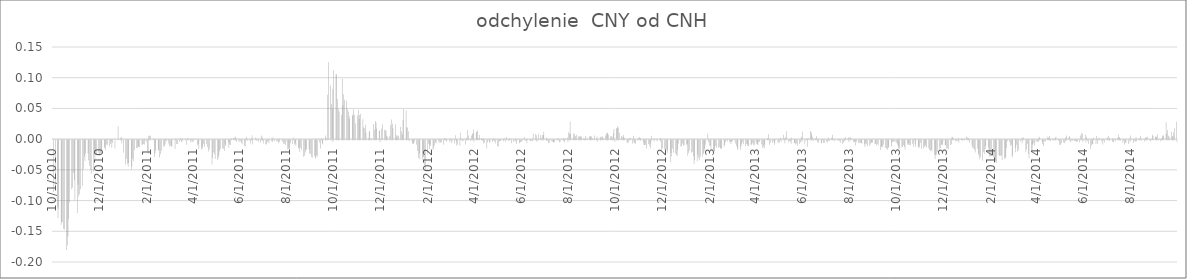
| Category | odchylenie  CNY od CNH |
|---|---|
| 10/1/10 | -0.084 |
| 10/4/10 | -0.08 |
| 10/5/10 | 0 |
| 10/6/10 | -0.109 |
| 10/7/10 | -0.127 |
| 10/8/10 | -0.112 |
| 10/11/10 | -0.138 |
| 10/12/10 | -0.133 |
| 10/13/10 | -0.133 |
| 10/14/10 | -0.144 |
| 10/15/10 | -0.146 |
| 10/18/10 | -0.179 |
| 10/19/10 | -0.171 |
| 10/20/10 | -0.157 |
| 10/21/10 | -0.128 |
| 10/22/10 | -0.101 |
| 10/25/10 | -0.08 |
| 10/26/10 | -0.077 |
| 10/27/10 | -0.054 |
| 10/28/10 | -0.065 |
| 10/29/10 | -0.098 |
| 11/1/10 | -0.119 |
| 11/2/10 | -0.072 |
| 11/3/10 | -0.092 |
| 11/4/10 | -0.088 |
| 11/5/10 | -0.08 |
| 11/8/10 | -0.074 |
| 11/9/10 | -0.047 |
| 11/10/10 | -0.026 |
| 11/11/10 | -0.034 |
| 11/12/10 | -0.022 |
| 11/15/10 | -0.022 |
| 11/16/10 | -0.033 |
| 11/17/10 | -0.042 |
| 11/18/10 | -0.048 |
| 11/19/10 | -0.055 |
| 11/22/10 | -0.051 |
| 11/23/10 | -0.023 |
| 11/24/10 | -0.033 |
| 11/25/10 | -0.021 |
| 11/26/10 | -0.024 |
| 11/29/10 | -0.02 |
| 11/30/10 | -0.025 |
| 12/1/10 | -0.021 |
| 12/2/10 | -0.016 |
| 12/3/10 | -0.021 |
| 12/6/10 | -0.013 |
| 12/7/10 | -0.011 |
| 12/8/10 | -0.017 |
| 12/9/10 | -0.007 |
| 12/10/10 | -0.008 |
| 12/13/10 | -0.01 |
| 12/14/10 | -0.006 |
| 12/15/10 | -0.002 |
| 12/16/10 | -0.013 |
| 12/17/10 | -0.004 |
| 12/20/10 | -0.014 |
| 12/21/10 | 0 |
| 12/22/10 | 0 |
| 12/23/10 | 0 |
| 12/24/10 | 0.021 |
| 12/27/10 | 0.002 |
| 12/28/10 | 0.003 |
| 12/29/10 | -0.005 |
| 12/30/10 | 0 |
| 12/31/10 | -0.02 |
| 1/3/11 | -0.04 |
| 1/4/11 | -0.03 |
| 1/5/11 | -0.039 |
| 1/6/11 | -0.044 |
| 1/7/11 | -0.037 |
| 1/10/11 | -0.048 |
| 1/11/11 | -0.043 |
| 1/12/11 | -0.031 |
| 1/13/11 | -0.034 |
| 1/14/11 | -0.017 |
| 1/17/11 | -0.013 |
| 1/18/11 | -0.013 |
| 1/19/11 | -0.01 |
| 1/20/11 | -0.011 |
| 1/21/11 | -0.011 |
| 1/24/11 | -0.007 |
| 1/25/11 | -0.007 |
| 1/26/11 | -0.006 |
| 1/27/11 | -0.007 |
| 1/28/11 | 0 |
| 1/31/11 | -0.018 |
| 2/1/11 | -0.023 |
| 2/2/11 | 0.005 |
| 2/3/11 | 0.005 |
| 2/4/11 | 0.005 |
| 2/7/11 | 0 |
| 2/8/11 | 0.001 |
| 2/9/11 | -0.027 |
| 2/10/11 | -0.022 |
| 2/11/11 | -0.017 |
| 2/14/11 | -0.016 |
| 2/15/11 | -0.016 |
| 2/16/11 | -0.028 |
| 2/17/11 | -0.023 |
| 2/18/11 | -0.017 |
| 2/21/11 | -0.011 |
| 2/22/11 | -0.011 |
| 2/23/11 | -0.007 |
| 2/24/11 | 0.001 |
| 2/25/11 | -0.002 |
| 2/28/11 | -0.005 |
| 3/1/11 | -0.011 |
| 3/2/11 | -0.009 |
| 3/3/11 | -0.01 |
| 3/4/11 | -0.011 |
| 3/7/11 | 0 |
| 3/8/11 | -0.014 |
| 3/9/11 | 0.001 |
| 3/10/11 | -0.006 |
| 3/11/11 | -0.006 |
| 3/14/11 | -0.003 |
| 3/15/11 | 0.002 |
| 3/16/11 | -0.002 |
| 3/17/11 | -0.003 |
| 3/18/11 | 0.001 |
| 3/21/11 | 0 |
| 3/22/11 | 0 |
| 3/23/11 | -0.008 |
| 3/24/11 | 0.002 |
| 3/25/11 | 0.001 |
| 3/28/11 | -0.003 |
| 3/29/11 | 0.001 |
| 3/30/11 | 0.001 |
| 3/31/11 | -0.003 |
| 4/1/11 | -0.002 |
| 4/4/11 | 0 |
| 4/5/11 | 0 |
| 4/6/11 | -0.008 |
| 4/7/11 | -0.006 |
| 4/8/11 | -0.014 |
| 4/11/11 | -0.015 |
| 4/12/11 | -0.011 |
| 4/13/11 | -0.014 |
| 4/14/11 | -0.006 |
| 4/15/11 | -0.011 |
| 4/18/11 | -0.007 |
| 4/19/11 | -0.011 |
| 4/20/11 | -0.018 |
| 4/21/11 | 0 |
| 4/22/11 | -0.015 |
| 4/25/11 | -0.04 |
| 4/26/11 | -0.029 |
| 4/27/11 | -0.02 |
| 4/28/11 | -0.023 |
| 4/29/11 | -0.03 |
| 5/2/11 | -0.032 |
| 5/3/11 | -0.03 |
| 5/4/11 | -0.024 |
| 5/5/11 | -0.018 |
| 5/6/11 | -0.014 |
| 5/9/11 | -0.013 |
| 5/10/11 | -0.014 |
| 5/11/11 | -0.018 |
| 5/12/11 | -0.007 |
| 5/13/11 | -0.01 |
| 5/16/11 | -0.004 |
| 5/17/11 | -0.013 |
| 5/18/11 | -0.007 |
| 5/19/11 | -0.008 |
| 5/20/11 | 0.001 |
| 5/23/11 | 0.002 |
| 5/24/11 | 0.002 |
| 5/25/11 | 0.004 |
| 5/26/11 | 0.002 |
| 5/27/11 | -0.003 |
| 5/30/11 | -0.001 |
| 5/31/11 | 0.001 |
| 6/1/11 | -0.002 |
| 6/2/11 | -0.004 |
| 6/3/11 | -0.006 |
| 6/6/11 | -0.009 |
| 6/7/11 | -0.01 |
| 6/8/11 | 0 |
| 6/9/11 | 0.004 |
| 6/10/11 | -0.001 |
| 6/13/11 | -0.001 |
| 6/14/11 | -0.005 |
| 6/15/11 | 0.001 |
| 6/16/11 | 0.006 |
| 6/17/11 | -0.007 |
| 6/20/11 | 0 |
| 6/21/11 | 0.003 |
| 6/22/11 | -0.001 |
| 6/23/11 | 0 |
| 6/24/11 | -0.003 |
| 6/27/11 | -0.004 |
| 6/28/11 | 0.006 |
| 6/29/11 | 0.004 |
| 6/30/11 | -0.001 |
| 7/1/11 | -0.006 |
| 7/4/11 | -0.007 |
| 7/5/11 | -0.007 |
| 7/6/11 | -0.003 |
| 7/7/11 | -0.002 |
| 7/8/11 | -0.005 |
| 7/11/11 | -0.002 |
| 7/12/11 | 0.003 |
| 7/13/11 | -0.003 |
| 7/14/11 | 0.001 |
| 7/15/11 | -0.001 |
| 7/18/11 | -0.002 |
| 7/19/11 | -0.002 |
| 7/20/11 | -0.005 |
| 7/21/11 | 0.001 |
| 7/22/11 | -0.003 |
| 7/25/11 | 0 |
| 7/26/11 | -0.003 |
| 7/27/11 | -0.006 |
| 7/28/11 | -0.006 |
| 7/29/11 | -0.008 |
| 8/1/11 | -0.015 |
| 8/2/11 | -0.015 |
| 8/3/11 | -0.012 |
| 8/4/11 | -0.015 |
| 8/5/11 | -0.005 |
| 8/8/11 | -0.006 |
| 8/9/11 | 0.003 |
| 8/10/11 | -0.007 |
| 8/11/11 | -0.006 |
| 8/12/11 | -0.009 |
| 8/15/11 | -0.013 |
| 8/16/11 | -0.012 |
| 8/17/11 | -0.019 |
| 8/18/11 | -0.013 |
| 8/19/11 | -0.016 |
| 8/22/11 | -0.027 |
| 8/23/11 | -0.026 |
| 8/24/11 | -0.02 |
| 8/25/11 | -0.016 |
| 8/26/11 | -0.015 |
| 8/29/11 | -0.015 |
| 8/30/11 | -0.022 |
| 8/31/11 | -0.022 |
| 9/1/11 | -0.027 |
| 9/2/11 | -0.028 |
| 9/5/11 | -0.026 |
| 9/6/11 | -0.03 |
| 9/7/11 | -0.028 |
| 9/8/11 | -0.024 |
| 9/9/11 | -0.027 |
| 9/12/11 | -0.004 |
| 9/13/11 | -0.014 |
| 9/14/11 | 0.002 |
| 9/15/11 | -0.005 |
| 9/16/11 | -0.006 |
| 9/19/11 | 0.006 |
| 9/20/11 | 0.002 |
| 9/21/11 | 0 |
| 9/22/11 | 0.072 |
| 9/23/11 | 0.126 |
| 9/26/11 | 0.088 |
| 9/27/11 | 0.058 |
| 9/28/11 | 0.049 |
| 9/29/11 | 0.082 |
| 9/30/11 | 0.112 |
| 10/3/11 | 0.106 |
| 10/4/11 | 0.106 |
| 10/5/11 | 0.066 |
| 10/6/11 | 0.049 |
| 10/7/11 | 0.045 |
| 10/10/11 | 0.04 |
| 10/11/11 | 0.098 |
| 10/12/11 | 0.055 |
| 10/13/11 | 0.073 |
| 10/14/11 | 0.064 |
| 10/17/11 | 0.063 |
| 10/18/11 | 0.05 |
| 10/19/11 | 0.045 |
| 10/20/11 | 0.037 |
| 10/21/11 | 0.033 |
| 10/24/11 | 0.038 |
| 10/25/11 | 0.04 |
| 10/26/11 | 0.049 |
| 10/27/11 | 0.04 |
| 10/28/11 | 0.026 |
| 10/31/11 | 0.038 |
| 11/1/11 | 0.047 |
| 11/2/11 | 0.033 |
| 11/3/11 | 0.039 |
| 11/4/11 | 0.042 |
| 11/7/11 | 0.032 |
| 11/8/11 | 0.019 |
| 11/9/11 | 0.018 |
| 11/10/11 | 0.024 |
| 11/11/11 | 0.011 |
| 11/14/11 | 0.002 |
| 11/15/11 | 0.013 |
| 11/16/11 | 0.013 |
| 11/17/11 | 0 |
| 11/18/11 | 0.001 |
| 11/21/11 | 0.025 |
| 11/22/11 | 0.016 |
| 11/23/11 | 0.029 |
| 11/24/11 | 0.026 |
| 11/25/11 | 0.017 |
| 11/28/11 | 0.014 |
| 11/29/11 | 0.014 |
| 11/30/11 | 0.001 |
| 12/1/11 | 0.018 |
| 12/2/11 | 0.024 |
| 12/5/11 | 0.015 |
| 12/6/11 | 0.015 |
| 12/7/11 | 0.013 |
| 12/8/11 | 0.006 |
| 12/9/11 | 0.004 |
| 12/12/11 | 0.005 |
| 12/13/11 | 0.023 |
| 12/14/11 | 0.032 |
| 12/15/11 | 0.026 |
| 12/16/11 | 0.018 |
| 12/19/11 | 0.024 |
| 12/20/11 | 0.007 |
| 12/21/11 | 0.004 |
| 12/22/11 | 0.006 |
| 12/23/11 | 0.006 |
| 12/26/11 | 0.02 |
| 12/27/11 | 0.013 |
| 12/28/11 | 0.008 |
| 12/29/11 | 0.031 |
| 12/30/11 | 0.049 |
| 1/2/12 | 0.047 |
| 1/3/12 | 0.02 |
| 1/4/12 | 0.019 |
| 1/5/12 | 0.013 |
| 1/6/12 | -0.002 |
| 1/9/12 | 0 |
| 1/10/12 | -0.006 |
| 1/11/12 | -0.005 |
| 1/12/12 | -0.006 |
| 1/13/12 | -0.002 |
| 1/16/12 | -0.008 |
| 1/17/12 | -0.018 |
| 1/18/12 | -0.029 |
| 1/19/12 | -0.021 |
| 1/20/12 | -0.031 |
| 1/23/12 | -0.032 |
| 1/24/12 | -0.027 |
| 1/25/12 | -0.028 |
| 1/26/12 | -0.041 |
| 1/27/12 | -0.047 |
| 1/30/12 | -0.023 |
| 1/31/12 | -0.006 |
| 2/1/12 | -0.014 |
| 2/2/12 | -0.008 |
| 2/3/12 | -0.01 |
| 2/6/12 | -0.016 |
| 2/7/12 | -0.013 |
| 2/8/12 | -0.008 |
| 2/9/12 | -0.004 |
| 2/10/12 | -0.005 |
| 2/13/12 | -0.002 |
| 2/14/12 | 0 |
| 2/15/12 | -0.005 |
| 2/16/12 | -0.003 |
| 2/17/12 | -0.003 |
| 2/20/12 | -0.007 |
| 2/21/12 | 0.002 |
| 2/22/12 | 0.001 |
| 2/23/12 | -0.002 |
| 2/24/12 | -0.002 |
| 2/27/12 | 0.001 |
| 2/28/12 | -0.003 |
| 2/29/12 | 0.002 |
| 3/1/12 | -0.005 |
| 3/2/12 | -0.002 |
| 3/5/12 | -0.006 |
| 3/6/12 | 0.006 |
| 3/7/12 | -0.002 |
| 3/8/12 | -0.009 |
| 3/9/12 | -0.007 |
| 3/12/12 | -0.009 |
| 3/13/12 | 0.01 |
| 3/14/12 | 0.001 |
| 3/15/12 | -0.001 |
| 3/16/12 | -0.002 |
| 3/19/12 | -0.007 |
| 3/20/12 | 0.001 |
| 3/21/12 | 0.001 |
| 3/22/12 | 0.015 |
| 3/23/12 | 0.006 |
| 3/26/12 | -0.002 |
| 3/27/12 | 0.006 |
| 3/28/12 | 0.009 |
| 3/29/12 | 0.009 |
| 3/30/12 | 0.016 |
| 4/2/12 | 0.011 |
| 4/3/12 | 0.012 |
| 4/4/12 | 0.014 |
| 4/5/12 | 0.002 |
| 4/6/12 | 0.007 |
| 4/9/12 | 0.002 |
| 4/10/12 | -0.001 |
| 4/11/12 | 0.002 |
| 4/12/12 | -0.005 |
| 4/13/12 | -0.005 |
| 4/16/12 | -0.014 |
| 4/17/12 | -0.003 |
| 4/18/12 | 0 |
| 4/19/12 | -0.004 |
| 4/20/12 | -0.003 |
| 4/23/12 | -0.003 |
| 4/24/12 | -0.001 |
| 4/25/12 | 0.002 |
| 4/26/12 | -0.002 |
| 4/27/12 | -0.005 |
| 4/30/12 | -0.009 |
| 5/1/12 | -0.011 |
| 5/2/12 | -0.002 |
| 5/3/12 | -0.001 |
| 5/4/12 | -0.002 |
| 5/7/12 | 0 |
| 5/8/12 | -0.002 |
| 5/9/12 | 0.001 |
| 5/10/12 | -0.002 |
| 5/11/12 | 0.003 |
| 5/14/12 | -0.001 |
| 5/15/12 | 0.001 |
| 5/16/12 | 0.002 |
| 5/17/12 | 0 |
| 5/18/12 | -0.005 |
| 5/21/12 | -0.003 |
| 5/22/12 | -0.001 |
| 5/23/12 | -0.002 |
| 5/24/12 | -0.006 |
| 5/25/12 | 0.001 |
| 5/28/12 | -0.005 |
| 5/29/12 | -0.003 |
| 5/30/12 | -0.003 |
| 5/31/12 | -0.003 |
| 6/1/12 | 0 |
| 6/4/12 | 0.003 |
| 6/5/12 | -0.001 |
| 6/6/12 | 0 |
| 6/7/12 | -0.005 |
| 6/8/12 | 0 |
| 6/11/12 | -0.002 |
| 6/12/12 | -0.001 |
| 6/13/12 | -0.001 |
| 6/14/12 | -0.002 |
| 6/15/12 | 0.009 |
| 6/18/12 | 0.008 |
| 6/19/12 | 0.006 |
| 6/20/12 | -0.002 |
| 6/21/12 | 0 |
| 6/22/12 | 0.009 |
| 6/25/12 | 0.007 |
| 6/26/12 | 0.002 |
| 6/27/12 | 0.007 |
| 6/28/12 | 0.006 |
| 6/29/12 | 0.012 |
| 7/2/12 | 0.003 |
| 7/3/12 | -0.001 |
| 7/4/12 | -0.001 |
| 7/5/12 | -0.005 |
| 7/6/12 | -0.004 |
| 7/9/12 | -0.002 |
| 7/10/12 | -0.002 |
| 7/11/12 | -0.004 |
| 7/12/12 | -0.003 |
| 7/13/12 | -0.003 |
| 7/16/12 | 0 |
| 7/17/12 | 0.002 |
| 7/18/12 | 0.001 |
| 7/19/12 | -0.003 |
| 7/20/12 | -0.003 |
| 7/23/12 | 0 |
| 7/24/12 | 0.002 |
| 7/25/12 | -0.001 |
| 7/26/12 | -0.004 |
| 7/27/12 | 0.001 |
| 7/30/12 | 0.003 |
| 7/31/12 | 0.011 |
| 8/1/12 | 0.009 |
| 8/2/12 | 0.029 |
| 8/3/12 | 0.009 |
| 8/6/12 | 0.003 |
| 8/7/12 | 0.01 |
| 8/8/12 | 0.008 |
| 8/9/12 | 0.005 |
| 8/10/12 | 0.007 |
| 8/13/12 | 0.005 |
| 8/14/12 | 0.004 |
| 8/15/12 | 0.005 |
| 8/16/12 | 0.003 |
| 8/17/12 | 0.005 |
| 8/20/12 | 0.002 |
| 8/21/12 | 0 |
| 8/22/12 | 0.005 |
| 8/23/12 | 0 |
| 8/24/12 | 0.002 |
| 8/27/12 | 0.004 |
| 8/28/12 | 0.005 |
| 8/29/12 | 0.004 |
| 8/30/12 | 0.004 |
| 8/31/12 | 0.002 |
| 9/3/12 | 0.006 |
| 9/4/12 | 0 |
| 9/5/12 | 0.001 |
| 9/6/12 | 0.004 |
| 9/7/12 | -0.003 |
| 9/10/12 | 0.004 |
| 9/11/12 | 0.002 |
| 9/12/12 | 0.004 |
| 9/13/12 | 0.005 |
| 9/14/12 | 0.002 |
| 9/17/12 | 0.006 |
| 9/18/12 | 0.009 |
| 9/19/12 | 0.009 |
| 9/20/12 | 0.01 |
| 9/21/12 | 0.007 |
| 9/24/12 | 0.005 |
| 9/25/12 | 0.005 |
| 9/26/12 | 0.003 |
| 9/27/12 | 0.009 |
| 9/28/12 | 0.016 |
| 10/1/12 | 0.018 |
| 10/2/12 | 0.017 |
| 10/3/12 | 0.021 |
| 10/4/12 | 0.019 |
| 10/5/12 | 0.011 |
| 10/8/12 | 0.005 |
| 10/9/12 | 0.004 |
| 10/10/12 | 0.007 |
| 10/11/12 | 0.003 |
| 10/12/12 | 0.001 |
| 10/15/12 | -0.005 |
| 10/16/12 | -0.003 |
| 10/17/12 | -0.004 |
| 10/18/12 | 0.001 |
| 10/19/12 | 0.002 |
| 10/22/12 | -0.005 |
| 10/23/12 | 0.006 |
| 10/24/12 | -0.003 |
| 10/25/12 | -0.005 |
| 10/26/12 | -0.006 |
| 10/29/12 | 0 |
| 10/30/12 | 0.002 |
| 10/31/12 | 0.003 |
| 11/1/12 | 0.002 |
| 11/2/12 | -0.001 |
| 11/5/12 | -0.004 |
| 11/6/12 | -0.008 |
| 11/7/12 | -0.008 |
| 11/8/12 | -0.008 |
| 11/9/12 | -0.014 |
| 11/12/12 | -0.006 |
| 11/13/12 | -0.009 |
| 11/14/12 | -0.013 |
| 11/15/12 | -0.005 |
| 11/16/12 | 0.006 |
| 11/19/12 | -0.002 |
| 11/20/12 | 0.001 |
| 11/21/12 | 0 |
| 11/22/12 | 0 |
| 11/23/12 | -0.002 |
| 11/26/12 | 0 |
| 11/27/12 | 0.002 |
| 11/28/12 | -0.003 |
| 11/29/12 | -0.017 |
| 11/30/12 | -0.013 |
| 12/3/12 | -0.015 |
| 12/4/12 | -0.019 |
| 12/5/12 | -0.016 |
| 12/6/12 | -0.016 |
| 12/7/12 | -0.02 |
| 12/10/12 | -0.036 |
| 12/11/12 | -0.021 |
| 12/12/12 | -0.027 |
| 12/13/12 | -0.014 |
| 12/14/12 | -0.02 |
| 12/17/12 | -0.022 |
| 12/18/12 | -0.024 |
| 12/19/12 | -0.025 |
| 12/20/12 | -0.016 |
| 12/21/12 | -0.005 |
| 12/24/12 | -0.011 |
| 12/25/12 | -0.01 |
| 12/26/12 | -0.006 |
| 12/27/12 | -0.009 |
| 12/28/12 | -0.008 |
| 12/31/12 | -0.007 |
| 1/1/13 | -0.007 |
| 1/2/13 | -0.026 |
| 1/3/13 | -0.021 |
| 1/4/13 | -0.017 |
| 1/7/13 | -0.02 |
| 1/8/13 | -0.019 |
| 1/9/13 | -0.026 |
| 1/10/13 | -0.039 |
| 1/11/13 | -0.032 |
| 1/14/13 | -0.035 |
| 1/15/13 | -0.023 |
| 1/16/13 | -0.029 |
| 1/17/13 | -0.033 |
| 1/18/13 | -0.026 |
| 1/21/13 | -0.027 |
| 1/22/13 | -0.023 |
| 1/23/13 | -0.018 |
| 1/24/13 | -0.014 |
| 1/25/13 | -0.007 |
| 1/28/13 | 0.009 |
| 1/29/13 | -0.004 |
| 1/30/13 | -0.009 |
| 1/31/13 | -0.009 |
| 2/1/13 | -0.015 |
| 2/4/13 | -0.016 |
| 2/5/13 | -0.018 |
| 2/6/13 | -0.018 |
| 2/7/13 | -0.01 |
| 2/8/13 | -0.012 |
| 2/11/13 | -0.013 |
| 2/12/13 | -0.011 |
| 2/13/13 | -0.014 |
| 2/14/13 | -0.014 |
| 2/15/13 | -0.014 |
| 2/18/13 | -0.011 |
| 2/19/13 | -0.008 |
| 2/20/13 | -0.003 |
| 2/21/13 | 0 |
| 2/22/13 | -0.002 |
| 2/25/13 | -0.003 |
| 2/26/13 | -0.003 |
| 2/27/13 | -0.006 |
| 2/28/13 | -0.003 |
| 3/1/13 | -0.002 |
| 3/4/13 | -0.001 |
| 3/5/13 | -0.005 |
| 3/6/13 | -0.01 |
| 3/7/13 | -0.016 |
| 3/8/13 | -0.013 |
| 3/11/13 | -0.016 |
| 3/12/13 | -0.011 |
| 3/13/13 | -0.007 |
| 3/14/13 | -0.003 |
| 3/15/13 | -0.007 |
| 3/18/13 | -0.01 |
| 3/19/13 | -0.006 |
| 3/20/13 | -0.007 |
| 3/21/13 | -0.01 |
| 3/22/13 | -0.01 |
| 3/25/13 | -0.008 |
| 3/26/13 | -0.007 |
| 3/27/13 | -0.005 |
| 3/28/13 | -0.008 |
| 3/29/13 | -0.008 |
| 4/1/13 | -0.006 |
| 4/2/13 | -0.007 |
| 4/3/13 | -0.008 |
| 4/4/13 | -0.003 |
| 4/5/13 | -0.003 |
| 4/8/13 | -0.007 |
| 4/9/13 | -0.013 |
| 4/10/13 | -0.01 |
| 4/11/13 | -0.014 |
| 4/12/13 | -0.008 |
| 4/15/13 | 0.001 |
| 4/16/13 | 0.001 |
| 4/17/13 | 0.008 |
| 4/18/13 | -0.007 |
| 4/19/13 | -0.004 |
| 4/22/13 | -0.004 |
| 4/23/13 | -0.002 |
| 4/24/13 | -0.008 |
| 4/25/13 | -0.005 |
| 4/26/13 | 0 |
| 4/29/13 | -0.005 |
| 4/30/13 | -0.002 |
| 5/1/13 | -0.004 |
| 5/2/13 | 0.002 |
| 5/3/13 | -0.003 |
| 5/6/13 | 0.007 |
| 5/7/13 | 0.001 |
| 5/8/13 | -0.005 |
| 5/9/13 | 0.004 |
| 5/10/13 | 0.013 |
| 5/13/13 | -0.004 |
| 5/14/13 | -0.001 |
| 5/15/13 | -0.003 |
| 5/16/13 | -0.006 |
| 5/17/13 | 0.003 |
| 5/20/13 | -0.005 |
| 5/21/13 | -0.005 |
| 5/22/13 | -0.007 |
| 5/23/13 | -0.006 |
| 5/24/13 | -0.009 |
| 5/27/13 | -0.006 |
| 5/28/13 | -0.004 |
| 5/29/13 | 0.002 |
| 5/30/13 | 0.004 |
| 5/31/13 | 0.013 |
| 6/3/13 | -0.007 |
| 6/4/13 | 0 |
| 6/5/13 | 0.001 |
| 6/6/13 | -0.011 |
| 6/7/13 | 0.002 |
| 6/10/13 | 0.013 |
| 6/11/13 | 0.011 |
| 6/12/13 | 0.007 |
| 6/13/13 | 0.004 |
| 6/14/13 | -0.001 |
| 6/17/13 | 0.002 |
| 6/18/13 | 0.005 |
| 6/19/13 | -0.004 |
| 6/20/13 | 0.002 |
| 6/21/13 | -0.004 |
| 6/24/13 | -0.005 |
| 6/25/13 | -0.005 |
| 6/26/13 | -0.001 |
| 6/27/13 | -0.005 |
| 6/28/13 | -0.004 |
| 7/1/13 | -0.003 |
| 7/2/13 | -0.004 |
| 7/3/13 | -0.001 |
| 7/4/13 | 0.003 |
| 7/5/13 | -0.002 |
| 7/8/13 | 0.002 |
| 7/9/13 | 0.007 |
| 7/10/13 | 0.001 |
| 7/11/13 | -0.002 |
| 7/12/13 | 0 |
| 7/15/13 | 0 |
| 7/16/13 | 0 |
| 7/17/13 | 0 |
| 7/18/13 | -0.002 |
| 7/19/13 | -0.004 |
| 7/22/13 | -0.006 |
| 7/23/13 | -0.004 |
| 7/24/13 | -0.002 |
| 7/25/13 | 0.001 |
| 7/26/13 | 0.003 |
| 7/29/13 | 0.001 |
| 7/30/13 | 0.003 |
| 7/31/13 | 0.002 |
| 8/1/13 | 0.003 |
| 8/2/13 | 0 |
| 8/5/13 | -0.003 |
| 8/6/13 | -0.003 |
| 8/7/13 | -0.002 |
| 8/8/13 | -0.009 |
| 8/9/13 | -0.003 |
| 8/12/13 | -0.005 |
| 8/13/13 | -0.004 |
| 8/14/13 | -0.004 |
| 8/15/13 | -0.005 |
| 8/16/13 | -0.005 |
| 8/19/13 | -0.007 |
| 8/20/13 | -0.011 |
| 8/21/13 | -0.005 |
| 8/22/13 | -0.007 |
| 8/23/13 | -0.01 |
| 8/26/13 | -0.009 |
| 8/27/13 | -0.007 |
| 8/28/13 | -0.005 |
| 8/29/13 | -0.003 |
| 8/30/13 | -0.004 |
| 9/2/13 | -0.007 |
| 9/3/13 | -0.006 |
| 9/4/13 | -0.009 |
| 9/5/13 | -0.006 |
| 9/6/13 | -0.008 |
| 9/9/13 | -0.016 |
| 9/10/13 | -0.01 |
| 9/11/13 | -0.011 |
| 9/12/13 | -0.011 |
| 9/13/13 | -0.007 |
| 9/16/13 | -0.013 |
| 9/17/13 | -0.014 |
| 9/18/13 | -0.016 |
| 9/19/13 | -0.013 |
| 9/20/13 | -0.011 |
| 9/23/13 | -0.01 |
| 9/24/13 | -0.004 |
| 9/25/13 | -0.003 |
| 9/26/13 | -0.002 |
| 9/27/13 | -0.003 |
| 9/30/13 | -0.004 |
| 10/1/13 | -0.007 |
| 10/2/13 | -0.01 |
| 10/3/13 | -0.014 |
| 10/4/13 | -0.014 |
| 10/7/13 | -0.012 |
| 10/8/13 | -0.011 |
| 10/9/13 | -0.008 |
| 10/10/13 | -0.011 |
| 10/11/13 | -0.015 |
| 10/14/13 | -0.007 |
| 10/15/13 | -0.007 |
| 10/16/13 | -0.005 |
| 10/17/13 | -0.008 |
| 10/18/13 | -0.008 |
| 10/21/13 | -0.006 |
| 10/22/13 | -0.011 |
| 10/23/13 | 0.001 |
| 10/24/13 | -0.006 |
| 10/25/13 | -0.011 |
| 10/28/13 | -0.012 |
| 10/29/13 | -0.01 |
| 10/30/13 | -0.012 |
| 10/31/13 | -0.004 |
| 11/1/13 | -0.014 |
| 11/4/13 | -0.013 |
| 11/5/13 | -0.011 |
| 11/6/13 | -0.01 |
| 11/7/13 | -0.007 |
| 11/8/13 | -0.012 |
| 11/11/13 | -0.013 |
| 11/12/13 | -0.016 |
| 11/13/13 | -0.018 |
| 11/14/13 | -0.016 |
| 11/15/13 | -0.018 |
| 11/18/13 | -0.023 |
| 11/19/13 | -0.031 |
| 11/20/13 | -0.025 |
| 11/21/13 | -0.024 |
| 11/22/13 | -0.019 |
| 11/25/13 | -0.014 |
| 11/26/13 | -0.013 |
| 11/27/13 | -0.008 |
| 11/28/13 | -0.006 |
| 11/29/13 | -0.008 |
| 12/2/13 | -0.008 |
| 12/3/13 | -0.009 |
| 12/4/13 | -0.014 |
| 12/5/13 | -0.014 |
| 12/6/13 | -0.015 |
| 12/9/13 | -0.008 |
| 12/10/13 | -0.007 |
| 12/11/13 | 0.004 |
| 12/12/13 | 0.003 |
| 12/13/13 | 0.001 |
| 12/16/13 | -0.002 |
| 12/17/13 | -0.002 |
| 12/18/13 | -0.001 |
| 12/19/13 | 0.002 |
| 12/20/13 | -0.004 |
| 12/23/13 | 0.001 |
| 12/24/13 | 0.001 |
| 12/25/13 | -0.001 |
| 12/26/13 | 0 |
| 12/27/13 | 0.002 |
| 12/30/13 | 0.004 |
| 12/31/13 | 0.002 |
| 1/1/14 | 0.002 |
| 1/2/14 | 0.001 |
| 1/3/14 | -0.005 |
| 1/6/14 | -0.009 |
| 1/7/14 | -0.013 |
| 1/8/14 | -0.014 |
| 1/9/14 | -0.016 |
| 1/10/14 | -0.02 |
| 1/13/14 | -0.014 |
| 1/14/14 | -0.022 |
| 1/15/14 | -0.025 |
| 1/16/14 | -0.031 |
| 1/17/14 | -0.028 |
| 1/20/14 | -0.034 |
| 1/21/14 | -0.02 |
| 1/22/14 | -0.022 |
| 1/23/14 | -0.014 |
| 1/24/14 | -0.01 |
| 1/27/14 | -0.012 |
| 1/28/14 | -0.021 |
| 1/29/14 | -0.026 |
| 1/30/14 | -0.026 |
| 1/31/14 | -0.026 |
| 2/3/14 | -0.028 |
| 2/4/14 | -0.034 |
| 2/5/14 | -0.033 |
| 2/6/14 | -0.036 |
| 2/7/14 | -0.037 |
| 2/10/14 | -0.025 |
| 2/11/14 | -0.025 |
| 2/12/14 | -0.025 |
| 2/13/14 | -0.025 |
| 2/14/14 | -0.033 |
| 2/17/14 | -0.03 |
| 2/18/14 | -0.03 |
| 2/19/14 | -0.028 |
| 2/20/14 | -0.013 |
| 2/21/14 | -0.002 |
| 2/24/14 | -0.003 |
| 2/25/14 | -0.009 |
| 2/26/14 | -0.008 |
| 2/27/14 | -0.028 |
| 2/28/14 | -0.025 |
| 3/3/14 | -0.02 |
| 3/4/14 | -0.013 |
| 3/5/14 | -0.008 |
| 3/6/14 | -0.018 |
| 3/7/14 | -0.016 |
| 3/10/14 | -0.002 |
| 3/11/14 | 0 |
| 3/12/14 | -0.005 |
| 3/13/14 | 0.003 |
| 3/14/14 | 0.003 |
| 3/17/14 | -0.02 |
| 3/18/14 | -0.015 |
| 3/19/14 | -0.006 |
| 3/20/14 | -0.022 |
| 3/21/14 | -0.03 |
| 3/24/14 | -0.016 |
| 3/25/14 | -0.017 |
| 3/26/14 | -0.007 |
| 3/27/14 | -0.005 |
| 3/28/14 | -0.009 |
| 3/31/14 | -0.002 |
| 4/1/14 | -0.003 |
| 4/2/14 | -0.003 |
| 4/3/14 | 0.004 |
| 4/4/14 | 0.002 |
| 4/7/14 | -0.003 |
| 4/8/14 | -0.006 |
| 4/9/14 | -0.01 |
| 4/10/14 | -0.002 |
| 4/11/14 | -0.002 |
| 4/14/14 | 0.004 |
| 4/15/14 | 0.002 |
| 4/16/14 | 0.004 |
| 4/17/14 | 0.005 |
| 4/18/14 | -0.002 |
| 4/21/14 | 0.001 |
| 4/22/14 | -0.001 |
| 4/23/14 | 0.001 |
| 4/24/14 | 0.002 |
| 4/25/14 | 0.004 |
| 4/28/14 | -0.001 |
| 4/29/14 | 0 |
| 4/30/14 | -0.008 |
| 5/1/14 | -0.007 |
| 5/2/14 | -0.005 |
| 5/5/14 | -0.004 |
| 5/6/14 | -0.005 |
| 5/7/14 | -0.002 |
| 5/8/14 | 0.003 |
| 5/9/14 | 0.006 |
| 5/12/14 | 0.004 |
| 5/13/14 | 0.005 |
| 5/14/14 | -0.003 |
| 5/15/14 | -0.001 |
| 5/16/14 | -0.001 |
| 5/19/14 | -0.002 |
| 5/20/14 | -0.001 |
| 5/21/14 | -0.001 |
| 5/22/14 | -0.003 |
| 5/23/14 | -0.003 |
| 5/26/14 | -0.003 |
| 5/27/14 | 0.006 |
| 5/28/14 | 0.01 |
| 5/29/14 | 0.009 |
| 5/30/14 | -0.001 |
| 6/2/14 | 0.008 |
| 6/3/14 | -0.004 |
| 6/4/14 | 0.004 |
| 6/5/14 | -0.001 |
| 6/6/14 | -0.006 |
| 6/9/14 | -0.014 |
| 6/10/14 | -0.009 |
| 6/11/14 | -0.007 |
| 6/12/14 | -0.006 |
| 6/13/14 | 0.003 |
| 6/16/14 | -0.006 |
| 6/17/14 | 0.005 |
| 6/18/14 | -0.006 |
| 6/19/14 | 0.001 |
| 6/20/14 | 0.003 |
| 6/23/14 | -0.002 |
| 6/24/14 | 0.001 |
| 6/25/14 | -0.007 |
| 6/26/14 | 0.001 |
| 6/27/14 | -0.004 |
| 6/30/14 | 0.001 |
| 7/1/14 | 0.003 |
| 7/2/14 | 0.005 |
| 7/3/14 | -0.001 |
| 7/4/14 | 0.002 |
| 7/7/14 | -0.003 |
| 7/8/14 | 0.002 |
| 7/9/14 | -0.003 |
| 7/10/14 | 0 |
| 7/11/14 | -0.002 |
| 7/14/14 | 0.002 |
| 7/15/14 | 0.008 |
| 7/16/14 | 0.003 |
| 7/17/14 | 0.003 |
| 7/18/14 | -0.001 |
| 7/21/14 | -0.005 |
| 7/22/14 | -0.001 |
| 7/23/14 | -0.008 |
| 7/24/14 | -0.004 |
| 7/25/14 | -0.004 |
| 7/28/14 | -0.006 |
| 7/29/14 | 0 |
| 7/30/14 | 0.001 |
| 7/31/14 | 0.006 |
| 8/1/14 | 0 |
| 8/4/14 | -0.005 |
| 8/5/14 | -0.001 |
| 8/6/14 | -0.003 |
| 8/7/14 | 0.003 |
| 8/8/14 | -0.002 |
| 8/11/14 | 0.001 |
| 8/12/14 | 0.002 |
| 8/13/14 | 0.006 |
| 8/14/14 | -0.001 |
| 8/15/14 | 0 |
| 8/18/14 | -0.002 |
| 8/19/14 | 0.002 |
| 8/20/14 | 0.004 |
| 8/21/14 | 0.002 |
| 8/22/14 | 0.004 |
| 8/25/14 | 0 |
| 8/26/14 | -0.002 |
| 8/27/14 | 0 |
| 8/28/14 | 0.007 |
| 8/29/14 | 0.005 |
| 9/1/14 | 0.004 |
| 9/2/14 | 0.003 |
| 9/3/14 | 0.004 |
| 9/4/14 | 0.008 |
| 9/5/14 | 0 |
| 9/8/14 | -0.002 |
| 9/9/14 | 0.001 |
| 9/10/14 | 0.004 |
| 9/11/14 | 0.006 |
| 9/12/14 | 0.005 |
| 9/15/14 | 0.027 |
| 9/16/14 | 0.009 |
| 9/17/14 | 0.015 |
| 9/18/14 | 0.005 |
| 9/19/14 | 0.004 |
| 9/22/14 | 0.013 |
| 9/23/14 | 0.005 |
| 9/24/14 | 0.004 |
| 9/25/14 | 0.011 |
| 9/26/14 | 0.018 |
| 9/29/14 | 0.029 |
| 9/30/14 | 0.04 |